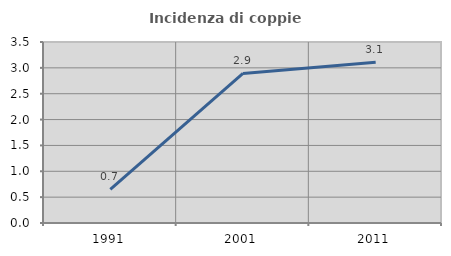
| Category | Incidenza di coppie miste |
|---|---|
| 1991.0 | 0.651 |
| 2001.0 | 2.892 |
| 2011.0 | 3.109 |